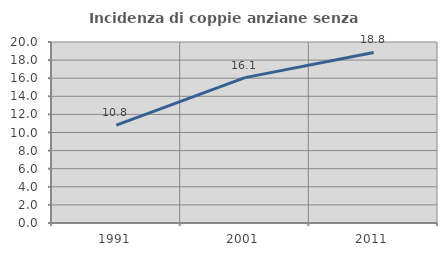
| Category | Incidenza di coppie anziane senza figli  |
|---|---|
| 1991.0 | 10.82 |
| 2001.0 | 16.066 |
| 2011.0 | 18.846 |